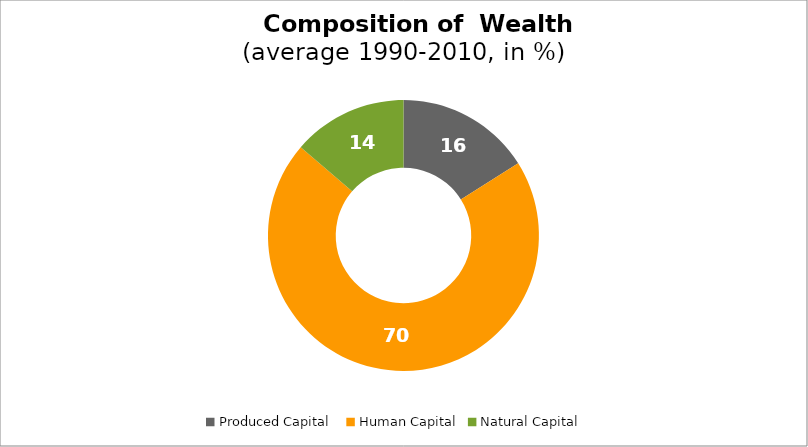
| Category | Series 0 |
|---|---|
| Produced Capital  | 16.063 |
| Human Capital | 70.237 |
| Natural Capital | 13.7 |